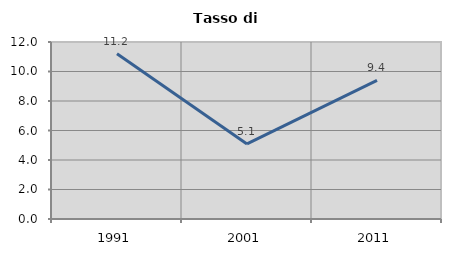
| Category | Tasso di disoccupazione   |
|---|---|
| 1991.0 | 11.205 |
| 2001.0 | 5.092 |
| 2011.0 | 9.397 |